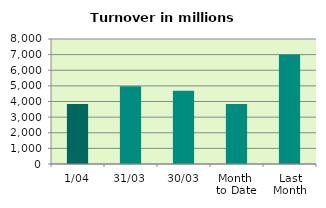
| Category | Series 0 |
|---|---|
| 1/04 | 3835.529 |
| 31/03 | 4969.333 |
| 30/03 | 4687.278 |
| Month 
to Date | 3835.529 |
| Last
Month | 7002.451 |